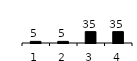
| Category | Series 0 |
|---|---|
| 1.0 | 5 |
| 2.0 | 5 |
| 3.0 | 35 |
| 4.0 | 35 |